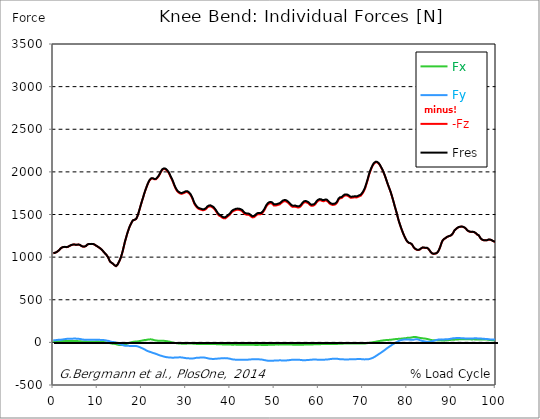
| Category |  Fx |  Fy |  -Fz |  Fres |
|---|---|---|---|---|
| 0.0 | 13.13 | 23.42 | 1044.74 | 1045.4 |
| 0.167348456675344 | 13.03 | 23.99 | 1047.57 | 1048.23 |
| 0.334696913350688 | 12.93 | 24.56 | 1050.39 | 1051.05 |
| 0.5020453700260321 | 13.1 | 25.89 | 1053.1 | 1053.77 |
| 0.669393826701376 | 13.39 | 27.31 | 1056.71 | 1057.39 |
| 0.83674228337672 | 13.74 | 28.32 | 1062.87 | 1063.55 |
| 1.0040907400520642 | 14.16 | 29.44 | 1068.6 | 1069.29 |
| 1.1621420602454444 | 14.28 | 29.87 | 1074.56 | 1075.24 |
| 1.3294905169207885 | 13.76 | 29.32 | 1083.38 | 1084.04 |
| 1.4968389735961325 | 14.11 | 29.59 | 1093.93 | 1094.59 |
| 1.6641874302714765 | 14.8 | 30.58 | 1102.71 | 1103.38 |
| 1.8315358869468206 | 14.91 | 31.75 | 1109.26 | 1109.94 |
| 1.9988843436221646 | 15.12 | 33.21 | 1113.77 | 1114.47 |
| 2.1662328002975086 | 15.27 | 34.6 | 1116.96 | 1117.7 |
| 2.333581256972853 | 15.54 | 35.99 | 1119.1 | 1119.87 |
| 2.5009297136481967 | 16.05 | 37.43 | 1119.98 | 1120.8 |
| 2.6682781703235405 | 16.32 | 38.75 | 1119.59 | 1120.46 |
| 2.8356266269988843 | 16.58 | 39.83 | 1116.8 | 1117.7 |
| 3.002975083674229 | 17.05 | 41.06 | 1116.68 | 1117.61 |
| 3.1703235403495724 | 17.52 | 42.12 | 1118.54 | 1119.5 |
| 3.337671997024917 | 17.31 | 42.03 | 1121.36 | 1122.32 |
| 3.4957233172182973 | 16.59 | 41.59 | 1124.92 | 1125.85 |
| 3.663071773893641 | 16.12 | 41.84 | 1131.47 | 1132.41 |
| 3.8304202305689854 | 15.96 | 42.09 | 1136.91 | 1137.86 |
| 3.997768687244329 | 16.28 | 42.57 | 1140.11 | 1141.07 |
| 4.165117143919673 | 16.83 | 43.03 | 1143.1 | 1144.08 |
| 4.332465600595017 | 17.16 | 43.49 | 1145.4 | 1146.4 |
| 4.499814057270361 | 17.27 | 44 | 1147.16 | 1148.18 |
| 4.667162513945706 | 17.28 | 44.38 | 1148.4 | 1149.44 |
| 4.834510970621049 | 16.98 | 44.33 | 1147.48 | 1148.52 |
| 5.001859427296393 | 16.86 | 44.5 | 1144.96 | 1146.01 |
| 5.169207883971737 | 16.72 | 43.94 | 1144.06 | 1145.1 |
| 5.336556340647081 | 15.89 | 42.63 | 1144.8 | 1145.78 |
| 5.503904797322425 | 15.12 | 42.28 | 1146.28 | 1147.23 |
| 5.671253253997769 | 14.48 | 41.87 | 1147.07 | 1148.01 |
| 5.82930457419115 | 14.15 | 41.4 | 1146.04 | 1146.96 |
| 5.996653030866494 | 13.93 | 40.48 | 1143.14 | 1144.04 |
| 6.164001487541838 | 13.38 | 39.12 | 1138.78 | 1139.65 |
| 6.331349944217181 | 11.65 | 36.2 | 1130.52 | 1131.39 |
| 6.498698400892526 | 10.52 | 34.15 | 1124.6 | 1125.48 |
| 6.66604685756787 | 10.25 | 33.22 | 1123.25 | 1124.14 |
| 6.833395314243213 | 10.06 | 31.94 | 1122.42 | 1123.27 |
| 7.000743770918558 | 9.83 | 31.46 | 1122.83 | 1123.69 |
| 7.168092227593902 | 9.6 | 31.32 | 1124.75 | 1125.63 |
| 7.335440684269246 | 9.3 | 31.08 | 1129.02 | 1129.94 |
| 7.50278914094459 | 8.84 | 30.25 | 1135.72 | 1136.67 |
| 7.6701375976199335 | 8.4 | 30.02 | 1145.78 | 1146.75 |
| 7.837486054295278 | 8.14 | 30.34 | 1150.02 | 1151 |
| 7.995537374488658 | 8.11 | 30.16 | 1153.33 | 1154.29 |
| 8.162885831164003 | 8.09 | 30.18 | 1154.93 | 1155.89 |
| 8.330234287839346 | 8.43 | 30.13 | 1153.94 | 1154.9 |
| 8.49758274451469 | 8.65 | 29.92 | 1153.38 | 1154.33 |
| 8.664931201190035 | 8.56 | 29.64 | 1154.48 | 1155.43 |
| 8.832279657865378 | 8.46 | 29.66 | 1154.69 | 1155.63 |
| 8.999628114540721 | 8.46 | 30.11 | 1153.1 | 1154.06 |
| 9.166976571216066 | 8.55 | 30.53 | 1150.47 | 1151.44 |
| 9.334325027891412 | 8.57 | 31.03 | 1146.01 | 1147.01 |
| 9.501673484566755 | 8.68 | 31.58 | 1140.18 | 1141.2 |
| 9.669021941242098 | 9.1 | 31.79 | 1133.74 | 1134.78 |
| 9.836370397917442 | 9.4 | 31.8 | 1128.05 | 1129.09 |
| 10.003718854592787 | 9.35 | 31.9 | 1123.65 | 1124.69 |
| 10.17106731126813 | 9.32 | 31.69 | 1118.65 | 1119.68 |
| 10.329118631461512 | 9.03 | 30.96 | 1112.27 | 1113.29 |
| 10.496467088136853 | 8.27 | 29.24 | 1105.78 | 1106.75 |
| 10.663815544812199 | 7.66 | 28.46 | 1099.43 | 1100.35 |
| 10.831164001487544 | 6.5 | 27.63 | 1092.27 | 1093.18 |
| 10.998512458162887 | 5.6 | 27.15 | 1083.94 | 1084.83 |
| 11.16586091483823 | 5.22 | 27.55 | 1074.71 | 1075.61 |
| 11.333209371513574 | 4.22 | 26.96 | 1063.79 | 1064.65 |
| 11.50055782818892 | 2.63 | 25.79 | 1052.78 | 1053.6 |
| 11.667906284864264 | 2.37 | 25.74 | 1043.7 | 1044.49 |
| 11.835254741539607 | 0.74 | 23.42 | 1034.31 | 1035.01 |
| 12.00260319821495 | -0.8 | 21.02 | 1026.03 | 1026.65 |
| 12.169951654890292 | -1.76 | 20.16 | 1015.76 | 1016.35 |
| 12.337300111565641 | -2.82 | 19.53 | 1000.92 | 1001.5 |
| 12.504648568240984 | -4.47 | 17.27 | 982.23 | 982.76 |
| 12.662699888434362 | -6.98 | 14.1 | 963.98 | 964.45 |
| 12.830048345109708 | -9.5 | 10.89 | 946.24 | 946.67 |
| 12.997396801785053 | -11.98 | 7.36 | 937.84 | 938.28 |
| 13.164745258460396 | -13.79 | 4.74 | 933.15 | 933.63 |
| 13.33209371513574 | -14.95 | 4.11 | 927.41 | 927.89 |
| 13.499442171811083 | -16.02 | 3.58 | 921.56 | 922.03 |
| 13.666790628486426 | -16.45 | 3.79 | 912.76 | 913.21 |
| 13.834139085161771 | -17.53 | 2.48 | 904.6 | 905.05 |
| 14.001487541837117 | -18.95 | 0.4 | 896.77 | 897.23 |
| 14.16883599851246 | -20.69 | -2.22 | 894.61 | 895.1 |
| 14.336184455187803 | -23.49 | -6.28 | 900.52 | 901.07 |
| 14.503532911863147 | -26.57 | -11.03 | 911.24 | 911.89 |
| 14.670881368538492 | -28.65 | -14.77 | 926.47 | 927.21 |
| 14.828932688731873 | -30.35 | -18.33 | 944.15 | 944.97 |
| 14.996281145407215 | -31.22 | -20.34 | 961.71 | 962.59 |
| 15.163629602082558 | -31.33 | -22.81 | 982.91 | 983.82 |
| 15.330978058757903 | -31.22 | -25.5 | 1007.71 | 1008.67 |
| 15.498326515433247 | -30.98 | -27.99 | 1036.47 | 1037.47 |
| 15.665674972108594 | -30.29 | -30.33 | 1068.24 | 1069.28 |
| 15.833023428783937 | -30.5 | -33.74 | 1103.97 | 1105.1 |
| 16.00037188545928 | -29.56 | -37.38 | 1140.15 | 1141.33 |
| 16.167720342134626 | -26.54 | -38.78 | 1177.28 | 1178.42 |
| 16.335068798809967 | -23.42 | -39.6 | 1207.48 | 1208.56 |
| 16.502417255485312 | -19.34 | -39.13 | 1238.02 | 1239.03 |
| 16.669765712160658 | -15.82 | -39.13 | 1268.8 | 1269.77 |
| 16.837114168836 | -11.96 | -39.88 | 1297.23 | 1298.19 |
| 17.004462625511344 | -9.05 | -40.69 | 1322.12 | 1323.08 |
| 17.16251394570472 | -6.18 | -41.59 | 1346.8 | 1347.79 |
| 17.32986240238007 | -3.07 | -42.03 | 1368.26 | 1369.25 |
| 17.497210859055414 | -0.83 | -42.18 | 1386.07 | 1387.06 |
| 17.664559315730756 | 1.4 | -42.32 | 1403.5 | 1404.49 |
| 17.8319077724061 | 3.68 | -42.36 | 1419.08 | 1420.05 |
| 17.999256229081443 | 5.96 | -42.54 | 1430.96 | 1431.94 |
| 18.166604685756788 | 7.83 | -42.61 | 1437.79 | 1438.77 |
| 18.333953142432133 | 8.64 | -41.86 | 1436.58 | 1437.55 |
| 18.501301599107478 | 9.32 | -41.35 | 1436.93 | 1437.88 |
| 18.668650055782823 | 9.83 | -42.05 | 1445.34 | 1446.32 |
| 18.835998512458165 | 10.23 | -43.58 | 1458.23 | 1459.27 |
| 19.00334696913351 | 11.38 | -45.82 | 1477.96 | 1479.07 |
| 19.170695425808855 | 12.81 | -48.89 | 1502.79 | 1504 |
| 19.338043882484197 | 14.24 | -52.24 | 1531.6 | 1532.91 |
| 19.496095202677576 | 15.66 | -55.63 | 1561.79 | 1563.19 |
| 19.66344365935292 | 17.06 | -59.23 | 1591.81 | 1593.32 |
| 19.830792116028263 | 18.68 | -63.28 | 1621.54 | 1623.21 |
| 19.998140572703612 | 20.64 | -67.01 | 1650.55 | 1652.39 |
| 20.165489029378953 | 22.52 | -70.87 | 1677.87 | 1679.88 |
| 20.3328374860543 | 24.74 | -74.95 | 1705.67 | 1707.86 |
| 20.500185942729644 | 26.55 | -79.57 | 1735.25 | 1737.65 |
| 20.667534399404985 | 27.96 | -83.92 | 1762.51 | 1765.1 |
| 20.83488285608033 | 28.52 | -88.97 | 1786.67 | 1789.53 |
| 21.002231312755672 | 29.02 | -93.74 | 1809.97 | 1813.06 |
| 21.16957976943102 | 30.49 | -98.19 | 1834.41 | 1837.73 |
| 21.336928226106362 | 32.38 | -101.86 | 1856.26 | 1859.79 |
| 21.504276682781704 | 33.67 | -105.36 | 1875.37 | 1879.07 |
| 21.67162513945705 | 34.7 | -108.5 | 1892.4 | 1896.26 |
| 21.82967645965043 | 35.38 | -111.21 | 1905.88 | 1909.89 |
| 21.997024916325774 | 35.61 | -113.83 | 1915.95 | 1920.09 |
| 22.16437337300112 | 35.12 | -116.83 | 1921.38 | 1925.67 |
| 22.33172182967646 | 33.45 | -120.11 | 1921.61 | 1926.05 |
| 22.499070286351806 | 31.04 | -123.61 | 1920.84 | 1925.42 |
| 22.666418743027148 | 28.21 | -126.16 | 1915.47 | 1920.19 |
| 22.833767199702496 | 25.8 | -128.49 | 1912.22 | 1917.08 |
| 23.00111565637784 | 23.92 | -130.96 | 1912.61 | 1917.61 |
| 23.168464113053183 | 22.25 | -133.92 | 1912.99 | 1918.18 |
| 23.335812569728528 | 21.15 | -137.73 | 1917.05 | 1922.5 |
| 23.50316102640387 | 20.61 | -140.65 | 1928.8 | 1934.42 |
| 23.670509483079215 | 20.03 | -144.54 | 1939.88 | 1945.75 |
| 23.83785793975456 | 19.07 | -148.35 | 1951.04 | 1957.16 |
| 23.995909259947936 | 19.2 | -151.58 | 1966.91 | 1973.23 |
| 24.163257716623285 | 19.66 | -154.01 | 1983.57 | 1990.03 |
| 24.330606173298627 | 19.54 | -156.4 | 2000.06 | 2006.66 |
| 24.49795462997397 | 19.77 | -158.88 | 2013.6 | 2020.37 |
| 24.665303086649313 | 19.84 | -161.47 | 2025.67 | 2032.62 |
| 24.83265154332466 | 19.2 | -164.35 | 2032.11 | 2039.28 |
| 25.0 | 18.29 | -166.88 | 2034.04 | 2041.38 |
| 25.167348456675345 | 17.34 | -168.93 | 2034.27 | 2041.77 |
| 25.334696913350694 | 16.26 | -170.71 | 2030.72 | 2038.36 |
| 25.502045370026035 | 15.04 | -172.46 | 2024.66 | 2032.46 |
| 25.669393826701377 | 13.69 | -174.12 | 2016.06 | 2023.99 |
| 25.836742283376722 | 12.58 | -175.15 | 2005.9 | 2013.95 |
| 26.004090740052067 | 11.13 | -176.21 | 1994.48 | 2002.66 |
| 26.17143919672741 | 9.46 | -177.28 | 1979.63 | 1987.94 |
| 26.329490516920792 | 7.91 | -177.39 | 1961.72 | 1970.09 |
| 26.49683897359613 | 5.37 | -177.16 | 1939.95 | 1948.32 |
| 26.66418743027148 | 2.41 | -178.67 | 1925.26 | 1933.79 |
| 26.831535886946828 | -0.1 | -180.23 | 1907.36 | 1916.09 |
| 26.998884343622166 | -1.88 | -180.92 | 1886.3 | 1895.17 |
| 27.166232800297514 | -3.19 | -179.72 | 1864.22 | 1873.12 |
| 27.333581256972852 | -4.9 | -178.7 | 1839.83 | 1848.79 |
| 27.5009297136482 | -6.24 | -178.15 | 1821 | 1830.02 |
| 27.668278170323543 | -7.89 | -177.97 | 1802.69 | 1811.8 |
| 27.835626626998888 | -9.51 | -177.18 | 1786.74 | 1795.87 |
| 28.002975083674233 | -10.9 | -176.61 | 1773.23 | 1782.38 |
| 28.170323540349575 | -12.11 | -176.24 | 1762.73 | 1771.92 |
| 28.33767199702492 | -13.31 | -176.02 | 1756.58 | 1765.8 |
| 28.50502045370026 | -13.98 | -175.43 | 1751.03 | 1760.24 |
| 28.663071773893645 | -14.35 | -175.62 | 1746.83 | 1756.11 |
| 28.830420230568986 | -14.7 | -176.06 | 1743.8 | 1753.16 |
| 28.99776868724433 | -14.85 | -176.34 | 1741.62 | 1751.03 |
| 29.165117143919673 | -14.65 | -177.28 | 1743.63 | 1753.15 |
| 29.33246560059502 | -14.88 | -179.47 | 1748.45 | 1758.19 |
| 29.499814057270367 | -14.81 | -180.87 | 1749.97 | 1759.84 |
| 29.66716251394571 | -15.05 | -182.26 | 1755.24 | 1765.22 |
| 29.834510970621054 | -15.05 | -183.69 | 1759.64 | 1769.74 |
| 30.00185942729639 | -14.97 | -185.15 | 1763.57 | 1773.8 |
| 30.169207883971744 | -14.75 | -186.31 | 1764.51 | 1774.85 |
| 30.33655634064708 | -14.56 | -187.25 | 1761.52 | 1771.99 |
| 30.50390479732243 | -13.72 | -187.58 | 1755.58 | 1766.14 |
| 30.671253253997772 | -12.8 | -187.63 | 1749.36 | 1759.98 |
| 30.829304574191156 | -12.22 | -188.17 | 1740.91 | 1751.65 |
| 30.996653030866494 | -12.4 | -188.68 | 1729.01 | 1739.89 |
| 31.164001487541842 | -13.08 | -189.09 | 1713.84 | 1724.85 |
| 31.331349944217187 | -13.74 | -188.76 | 1697.11 | 1708.17 |
| 31.498698400892525 | -14.6 | -188.58 | 1677.61 | 1688.75 |
| 31.666046857567874 | -15.69 | -187.93 | 1653.88 | 1665.08 |
| 31.833395314243212 | -16.69 | -185.76 | 1630.86 | 1641.97 |
| 32.00074377091856 | -17.15 | -184.56 | 1615.5 | 1626.56 |
| 32.1680922275939 | -17.3 | -182.64 | 1602.09 | 1613.01 |
| 32.33544068426925 | -17.75 | -180.92 | 1591.23 | 1602.01 |
| 32.50278914094459 | -18.19 | -180.14 | 1580.07 | 1590.85 |
| 32.670137597619934 | -18.68 | -179.64 | 1571.67 | 1582.45 |
| 32.83748605429528 | -19.06 | -179.3 | 1566.22 | 1577 |
| 33.004834510970625 | -19.48 | -179.14 | 1561.85 | 1572.63 |
| 33.162885831164004 | -19.69 | -178.8 | 1560.08 | 1570.84 |
| 33.33023428783935 | -19.59 | -178.13 | 1558.45 | 1569.14 |
| 33.497582744514695 | -19.28 | -177.22 | 1554.57 | 1565.19 |
| 33.664931201190036 | -18.92 | -176.39 | 1550.01 | 1560.57 |
| 33.83227965786538 | -18.72 | -176.42 | 1549.54 | 1560.1 |
| 33.99962811454073 | -18.9 | -176.89 | 1551.74 | 1562.34 |
| 34.16697657121607 | -19.06 | -178.32 | 1553.51 | 1564.28 |
| 34.33432502789141 | -19.08 | -179.98 | 1557.18 | 1568.13 |
| 34.50167348456676 | -18.9 | -181.38 | 1563.62 | 1574.7 |
| 34.6690219412421 | -19.02 | -183.34 | 1573.78 | 1585.02 |
| 34.83637039791744 | -19.07 | -186.04 | 1583.94 | 1595.42 |
| 35.00371885459279 | -19.11 | -187.6 | 1590.08 | 1601.71 |
| 35.17106731126814 | -19.26 | -189.72 | 1592.96 | 1604.83 |
| 35.338415767943474 | -19.28 | -191.53 | 1595.56 | 1607.64 |
| 35.49646708813686 | -19.31 | -192.34 | 1595.99 | 1608.16 |
| 35.6638155448122 | -19.43 | -192.95 | 1593.15 | 1605.44 |
| 35.831164001487544 | -19.86 | -193.88 | 1587.09 | 1599.57 |
| 35.998512458162885 | -19.97 | -194.48 | 1582.16 | 1594.76 |
| 36.165860914838234 | -19.98 | -194.71 | 1576.61 | 1589.28 |
| 36.333209371513576 | -19.98 | -194.2 | 1567.81 | 1580.49 |
| 36.50055782818892 | -20.08 | -193.45 | 1557.75 | 1570.41 |
| 36.667906284864266 | -20.29 | -192.25 | 1545.91 | 1558.51 |
| 36.83525474153961 | -20.74 | -191.68 | 1532.21 | 1544.85 |
| 37.002603198214956 | -21.24 | -191.49 | 1518.38 | 1531.12 |
| 37.1699516548903 | -21.32 | -190.57 | 1504.78 | 1517.53 |
| 37.337300111565646 | -21.52 | -188.98 | 1494.48 | 1507.1 |
| 37.50464856824098 | -22.26 | -188.21 | 1485.99 | 1498.61 |
| 37.66269988843437 | -22.56 | -187.95 | 1481.14 | 1493.77 |
| 37.83004834510971 | -22.86 | -187.59 | 1477.66 | 1490.26 |
| 37.99739680178505 | -23.28 | -187.21 | 1471.28 | 1483.9 |
| 38.16474525846039 | -23.45 | -186.28 | 1462.98 | 1475.56 |
| 38.33209371513574 | -23.88 | -185.47 | 1457.71 | 1470.24 |
| 38.49944217181109 | -24.37 | -184.89 | 1454.88 | 1467.38 |
| 38.666790628486424 | -24.69 | -184.73 | 1454.11 | 1466.6 |
| 38.83413908516178 | -25.03 | -184.66 | 1454.51 | 1466.99 |
| 39.001487541837115 | -25.18 | -185.02 | 1459.47 | 1471.96 |
| 39.16883599851246 | -25.51 | -185.79 | 1466.34 | 1478.89 |
| 39.336184455187805 | -25.67 | -186.8 | 1473.9 | 1486.53 |
| 39.503532911863154 | -25.9 | -187.92 | 1481.01 | 1493.74 |
| 39.670881368538495 | -26.2 | -189.55 | 1486.91 | 1499.79 |
| 39.83822982521384 | -26.15 | -191.2 | 1494.13 | 1507.17 |
| 39.996281145407224 | -26.06 | -192.36 | 1504.26 | 1517.35 |
| 40.163629602082565 | -26.38 | -194.47 | 1515.45 | 1528.72 |
| 40.33097805875791 | -26.55 | -197.78 | 1527.7 | 1541.29 |
| 40.498326515433256 | -26.53 | -199.22 | 1534.43 | 1548.13 |
| 40.6656749721086 | -26.54 | -200.39 | 1539.97 | 1553.77 |
| 40.83302342878393 | -26.52 | -201.38 | 1543.62 | 1557.5 |
| 41.00037188545929 | -26.34 | -202.01 | 1546.91 | 1560.83 |
| 41.16772034213463 | -26.42 | -203.09 | 1549.98 | 1564.02 |
| 41.33506879880997 | -26.48 | -203.79 | 1553.99 | 1568.07 |
| 41.50241725548531 | -26.63 | -203.9 | 1555.97 | 1570.04 |
| 41.66976571216066 | -27 | -204.62 | 1555.08 | 1569.25 |
| 41.837114168836 | -27.14 | -204.96 | 1554.64 | 1568.87 |
| 42.004462625511344 | -27.2 | -205.19 | 1553.96 | 1568.22 |
| 42.17181108218669 | -27.28 | -205.44 | 1552.15 | 1566.46 |
| 42.32986240238007 | -27.19 | -205.14 | 1548.51 | 1562.81 |
| 42.497210859055414 | -27.1 | -204.84 | 1544.86 | 1559.15 |
| 42.66455931573076 | -27.15 | -204.54 | 1540.16 | 1554.46 |
| 42.831907772406105 | -27.42 | -204.23 | 1532.45 | 1546.77 |
| 42.999256229081446 | -27.8 | -203.32 | 1520.2 | 1534.53 |
| 43.16660468575679 | -28.13 | -203.19 | 1509.98 | 1524.41 |
| 43.33395314243214 | -28.33 | -202.94 | 1503.69 | 1518.16 |
| 43.50130159910748 | -28.4 | -202.69 | 1499.74 | 1514.22 |
| 43.66865005578282 | -28.54 | -202.89 | 1498.2 | 1512.73 |
| 43.83599851245817 | -28.57 | -202.79 | 1497.91 | 1512.42 |
| 44.00334696913351 | -28.6 | -202.68 | 1497.63 | 1512.13 |
| 44.17069542580886 | -28.63 | -202.12 | 1495.58 | 1510.02 |
| 44.3380438824842 | -28.66 | -201.48 | 1492.51 | 1506.88 |
| 44.49609520267758 | -28.82 | -201.22 | 1487.06 | 1501.44 |
| 44.66344365935292 | -28.66 | -199.92 | 1478.23 | 1492.52 |
| 44.83079211602827 | -28.69 | -198.84 | 1471.77 | 1485.97 |
| 44.99814057270361 | -28.78 | -197.82 | 1465.99 | 1480.11 |
| 45.16548902937895 | -29.01 | -197.39 | 1465.29 | 1479.37 |
| 45.332837486054295 | -29.2 | -197.11 | 1468.42 | 1482.43 |
| 45.500185942729644 | -29.37 | -197.05 | 1473.44 | 1487.39 |
| 45.66753439940499 | -29.58 | -197.5 | 1479.52 | 1493.47 |
| 45.83488285608033 | -29.62 | -197.49 | 1487.49 | 1501.35 |
| 46.00223131275568 | -29.5 | -198.29 | 1497.04 | 1510.9 |
| 46.16957976943102 | -29.46 | -198.32 | 1501.25 | 1515.06 |
| 46.336928226106366 | -29.4 | -198.79 | 1504.6 | 1518.43 |
| 46.50427668278171 | -29.23 | -199.73 | 1505.81 | 1519.76 |
| 46.671625139457056 | -29.11 | -199.51 | 1503.69 | 1517.62 |
| 46.829676459650436 | -29.1 | -199.22 | 1501.45 | 1515.36 |
| 46.99702491632577 | -29.45 | -200.47 | 1504.54 | 1518.61 |
| 47.16437337300112 | -29.84 | -201.65 | 1511.44 | 1525.61 |
| 47.33172182967646 | -30.03 | -203.32 | 1521.28 | 1535.58 |
| 47.49907028635181 | -30.15 | -205.27 | 1532.79 | 1547.25 |
| 47.66641874302716 | -30.2 | -207.57 | 1546.9 | 1561.54 |
| 47.83376719970249 | -30.15 | -209.51 | 1561.93 | 1576.67 |
| 48.001115656377834 | -30.21 | -210.86 | 1580.01 | 1594.76 |
| 48.16846411305319 | -30.18 | -212.33 | 1596.28 | 1611.06 |
| 48.33581256972853 | -29.78 | -213.84 | 1607.84 | 1622.7 |
| 48.50316102640387 | -29.48 | -215.03 | 1618.19 | 1633.11 |
| 48.67050948307921 | -28.94 | -215.78 | 1625.49 | 1640.44 |
| 48.837857939754564 | -28.35 | -216.13 | 1629.76 | 1644.7 |
| 49.005206396429905 | -27.94 | -216.34 | 1632.21 | 1647.15 |
| 49.163257716623285 | -27.49 | -216.15 | 1631.78 | 1646.7 |
| 49.33060617329863 | -27.06 | -216.12 | 1629.59 | 1644.52 |
| 49.49795462997397 | -26.9 | -215.84 | 1626.08 | 1640.99 |
| 49.66530308664932 | -26.8 | -215.13 | 1617.3 | 1632.19 |
| 49.832651543324666 | -26.9 | -213.54 | 1606.4 | 1621.18 |
| 50.0 | -26.64 | -213.34 | 1603.72 | 1618.49 |
| 50.16734845667534 | -26.36 | -212.87 | 1604.67 | 1619.37 |
| 50.33469691335069 | -25.97 | -212.53 | 1605.25 | 1619.89 |
| 50.50204537002604 | -26.01 | -211.91 | 1607.35 | 1621.89 |
| 50.66939382670139 | -26.34 | -211.5 | 1610.14 | 1624.59 |
| 50.836742283376715 | -26.42 | -211.12 | 1613.17 | 1627.52 |
| 51.00409074005207 | -26.47 | -211.16 | 1614.91 | 1629.24 |
| 51.17143919672741 | -26.19 | -211.17 | 1618.04 | 1632.33 |
| 51.32949051692079 | -25.94 | -211.03 | 1624.53 | 1638.74 |
| 51.496838973596134 | -25.69 | -211.15 | 1632.25 | 1646.41 |
| 51.66418743027148 | -25.46 | -211.38 | 1640.56 | 1654.69 |
| 51.831535886946824 | -25.5 | -211.79 | 1648.16 | 1662.28 |
| 51.99888434362217 | -25.47 | -211.91 | 1651.74 | 1665.85 |
| 52.16623280029752 | -25.41 | -212.16 | 1654.53 | 1668.66 |
| 52.33358125697285 | -25.09 | -212.14 | 1655.72 | 1669.85 |
| 52.5009297136482 | -24.92 | -211.97 | 1654.91 | 1669.04 |
| 52.668278170323546 | -24.92 | -211.7 | 1652.74 | 1666.87 |
| 52.835626626998895 | -24.92 | -211.37 | 1646.71 | 1660.84 |
| 53.00297508367424 | -25.07 | -210.44 | 1639.96 | 1654.02 |
| 53.17032354034958 | -25.25 | -209.32 | 1632.97 | 1646.95 |
| 53.33767199702492 | -25.55 | -208.41 | 1624.71 | 1638.65 |
| 53.50502045370027 | -25.74 | -207.49 | 1616.37 | 1630.27 |
| 53.663071773893655 | -25.91 | -205.89 | 1604.69 | 1618.49 |
| 53.83042023056899 | -26.1 | -204.74 | 1596.46 | 1610.19 |
| 53.99776868724433 | -26.43 | -204.15 | 1591.97 | 1605.68 |
| 54.16511714391967 | -26.87 | -203.95 | 1589.42 | 1603.15 |
| 54.33246560059503 | -27.13 | -204.1 | 1588.96 | 1602.73 |
| 54.49981405727037 | -27.18 | -203.87 | 1590.47 | 1604.19 |
| 54.667162513945705 | -27.15 | -203.64 | 1591.91 | 1605.57 |
| 54.834510970621054 | -27.12 | -203.52 | 1589.16 | 1602.82 |
| 55.0018594272964 | -27.25 | -203.57 | 1585.66 | 1599.38 |
| 55.169207883971744 | -27.42 | -203.55 | 1583.39 | 1597.14 |
| 55.336556340647086 | -27.61 | -203.49 | 1582.11 | 1595.86 |
| 55.50390479732243 | -27.85 | -204.25 | 1582.12 | 1595.99 |
| 55.671253253997776 | -27.84 | -204.91 | 1585.64 | 1599.57 |
| 55.83860171067312 | -27.87 | -205.42 | 1591.81 | 1605.76 |
| 55.9966530308665 | -27.68 | -206.39 | 1600.36 | 1614.37 |
| 56.16400148754184 | -27.55 | -207.96 | 1611.5 | 1625.61 |
| 56.33134994421718 | -27.21 | -209.01 | 1624.52 | 1638.66 |
| 56.498698400892536 | -26.81 | -209.46 | 1634.33 | 1648.44 |
| 56.66604685756788 | -26.34 | -209.56 | 1640.09 | 1654.15 |
| 56.83339531424321 | -26.03 | -209.05 | 1643.97 | 1657.92 |
| 57.00074377091856 | -25.72 | -208.68 | 1644.8 | 1658.69 |
| 57.16809222759391 | -25.46 | -208.42 | 1643.27 | 1657.14 |
| 57.33544068426925 | -25.01 | -207.94 | 1639.82 | 1653.64 |
| 57.5027891409446 | -24.39 | -207.26 | 1636.54 | 1650.29 |
| 57.670137597619934 | -23.94 | -206.51 | 1630.91 | 1644.61 |
| 57.83748605429528 | -23.89 | -206.06 | 1621.09 | 1634.8 |
| 58.004834510970625 | -23.87 | -204.9 | 1612.7 | 1626.33 |
| 58.16288583116401 | -23.99 | -203.83 | 1606.24 | 1619.78 |
| 58.330234287839346 | -24.12 | -203.27 | 1601.99 | 1615.49 |
| 58.497582744514695 | -23.98 | -202.6 | 1601.45 | 1614.87 |
| 58.66493120119004 | -23.76 | -201.95 | 1602.95 | 1616.27 |
| 58.832279657865385 | -23.47 | -202.13 | 1604.99 | 1618.3 |
| 58.999628114540734 | -23.17 | -202.15 | 1609.77 | 1623.04 |
| 59.16697657121607 | -22.61 | -202.17 | 1617.38 | 1630.57 |
| 59.33432502789142 | -22.18 | -202.08 | 1628.26 | 1641.35 |
| 59.50167348456676 | -21.53 | -202.29 | 1642.89 | 1655.9 |
| 59.66902194124211 | -21.39 | -202.52 | 1651.9 | 1664.86 |
| 59.83637039791745 | -21.43 | -203.4 | 1659.05 | 1672.06 |
| 60.00371885459278 | -21.38 | -204.21 | 1664.82 | 1677.89 |
| 60.17106731126813 | -21.19 | -204.63 | 1667.55 | 1680.65 |
| 60.33841576794349 | -20.88 | -204.66 | 1667.2 | 1680.31 |
| 60.49646708813685 | -20.59 | -204.47 | 1665.81 | 1678.92 |
| 60.6638155448122 | -20.17 | -204.1 | 1661.58 | 1674.67 |
| 60.831164001487544 | -20.14 | -203.52 | 1657.15 | 1670.2 |
| 60.99851245816289 | -20.04 | -202.99 | 1655.45 | 1668.45 |
| 61.16586091483824 | -19.95 | -202.59 | 1655.95 | 1668.9 |
| 61.333209371513576 | -19.99 | -202.48 | 1660.03 | 1672.95 |
| 61.50055782818892 | -19.95 | -202.33 | 1663.78 | 1676.67 |
| 61.667906284864266 | -19.69 | -202.04 | 1664.79 | 1677.64 |
| 61.835254741539615 | -19.65 | -201.54 | 1661.44 | 1674.26 |
| 62.002603198214956 | -19.72 | -200.67 | 1655.53 | 1668.29 |
| 62.16995165489029 | -19.88 | -199.5 | 1645.31 | 1658.01 |
| 62.33730011156564 | -20.04 | -198.08 | 1634.27 | 1646.89 |
| 62.504648568240995 | -20.05 | -196.83 | 1626.67 | 1639.2 |
| 62.67199702491633 | -19.8 | -195.53 | 1622.35 | 1634.76 |
| 62.83004834510971 | -19.45 | -194.34 | 1616.72 | 1629.02 |
| 62.99739680178505 | -19.29 | -193.34 | 1612.89 | 1625.09 |
| 63.1647452584604 | -19.18 | -192.78 | 1612.07 | 1624.19 |
| 63.33209371513575 | -19.14 | -192.69 | 1612.9 | 1624.99 |
| 63.4994421718111 | -19.16 | -192.77 | 1613.93 | 1626.01 |
| 63.666790628486424 | -19.13 | -192.67 | 1616.16 | 1628.2 |
| 63.83413908516177 | -18.97 | -192.39 | 1621.15 | 1633.11 |
| 64.00148754183712 | -18.71 | -192.52 | 1628.5 | 1640.42 |
| 64.16883599851248 | -18.18 | -192.82 | 1640.93 | 1652.81 |
| 64.3361844551878 | -17.53 | -193.61 | 1657.7 | 1669.56 |
| 64.50353291186315 | -16.78 | -195.37 | 1675.53 | 1687.47 |
| 64.6708813685385 | -16.53 | -196.64 | 1683.37 | 1695.41 |
| 64.83822982521384 | -16.29 | -197.7 | 1690.56 | 1702.68 |
| 65.00557828188919 | -16.05 | -198.38 | 1693.49 | 1705.67 |
| 65.16362960208257 | -15.78 | -198.4 | 1692.47 | 1704.66 |
| 65.3309780587579 | -15.5 | -198.22 | 1694.28 | 1706.44 |
| 65.49832651543326 | -15.1 | -198.78 | 1708.02 | 1720.16 |
| 65.6656749721086 | -14.51 | -199.41 | 1716.88 | 1729.05 |
| 65.83302342878395 | -14.38 | -199.92 | 1721.05 | 1733.28 |
| 66.00037188545929 | -14.24 | -200.17 | 1723.16 | 1735.43 |
| 66.16772034213463 | -14.13 | -200.64 | 1723.52 | 1735.85 |
| 66.33506879880998 | -13.91 | -200.91 | 1722.64 | 1735.02 |
| 66.50241725548531 | -13.59 | -201.01 | 1720.67 | 1733.08 |
| 66.66976571216065 | -13.36 | -200.63 | 1716.82 | 1729.21 |
| 66.83711416883601 | -13.48 | -199.56 | 1710.32 | 1722.65 |
| 67.00446262551135 | -13.66 | -198.43 | 1703.62 | 1715.87 |
| 67.1718110821867 | -13.9 | -197.48 | 1697.56 | 1709.75 |
| 67.32986240238007 | -14.16 | -197.31 | 1696.32 | 1708.52 |
| 67.49721085905541 | -14.26 | -197.53 | 1697.16 | 1709.4 |
| 67.66455931573076 | -14.17 | -197.61 | 1698.17 | 1710.41 |
| 67.83190777240611 | -14.09 | -197.62 | 1699.48 | 1711.7 |
| 67.99925622908145 | -14.02 | -197.49 | 1701.31 | 1713.5 |
| 68.16660468575678 | -14.11 | -197.53 | 1701.66 | 1713.85 |
| 68.33395314243214 | -14.16 | -197 | 1701.02 | 1713.16 |
| 68.50130159910749 | -14 | -196.43 | 1700.04 | 1712.12 |
| 68.66865005578282 | -13.85 | -196.19 | 1700.42 | 1712.46 |
| 68.83599851245816 | -14.12 | -196.21 | 1704.7 | 1716.71 |
| 69.00334696913352 | -14.03 | -196.28 | 1710.73 | 1722.69 |
| 69.17069542580886 | -13.86 | -196.34 | 1713.35 | 1725.3 |
| 69.3380438824842 | -13.71 | -196.25 | 1715.31 | 1727.24 |
| 69.50539233915956 | -13.77 | -196 | 1720.44 | 1732.33 |
| 69.66344365935292 | -13.78 | -196.54 | 1729.51 | 1741.42 |
| 69.83079211602826 | -13.73 | -197.78 | 1742.03 | 1754.01 |
| 69.99814057270362 | -13.69 | -199.03 | 1754.55 | 1766.6 |
| 70.16548902937896 | -13.31 | -199.45 | 1770.14 | 1782.12 |
| 70.33283748605429 | -12.79 | -199.49 | 1787.14 | 1798.99 |
| 70.50018594272964 | -12.28 | -199.99 | 1808.4 | 1820.14 |
| 70.667534399405 | -11.52 | -199.34 | 1836.54 | 1847.99 |
| 70.83488285608033 | -10.21 | -198.48 | 1864.07 | 1875.17 |
| 71.00223131275568 | -9.13 | -197.66 | 1892.51 | 1903.34 |
| 71.16957976943102 | -7.86 | -197.53 | 1922.82 | 1933.43 |
| 71.33692822610637 | -6.32 | -196.83 | 1955.57 | 1965.91 |
| 71.50427668278171 | -4.66 | -194.44 | 1983.5 | 1993.43 |
| 71.67162513945706 | -3.1 | -192.08 | 2008.05 | 2017.59 |
| 71.8389735961324 | -1.62 | -189.16 | 2030.42 | 2039.56 |
| 71.99702491632577 | -0.24 | -186.09 | 2050.4 | 2059.13 |
| 72.16437337300113 | 1.19 | -182.49 | 2068.98 | 2077.28 |
| 72.33172182967647 | 2.66 | -178.59 | 2084.18 | 2092.06 |
| 72.49907028635181 | 4.11 | -174.14 | 2096.44 | 2103.87 |
| 72.66641874302715 | 5.55 | -168.71 | 2105.24 | 2112.18 |
| 72.8337671997025 | 7.23 | -163.31 | 2111.25 | 2117.74 |
| 73.00111565637783 | 8.95 | -157.56 | 2113.1 | 2119.15 |
| 73.16846411305319 | 10.8 | -151.98 | 2112.12 | 2117.78 |
| 73.33581256972853 | 12.61 | -146.27 | 2108.1 | 2113.36 |
| 73.50316102640387 | 13.99 | -140.48 | 2101.19 | 2106.08 |
| 73.67050948307921 | 15.73 | -134.82 | 2090.37 | 2094.93 |
| 73.83785793975457 | 17.07 | -129.02 | 2078.55 | 2082.77 |
| 74.00520639642991 | 18.88 | -123.72 | 2062.8 | 2066.78 |
| 74.16325771662328 | 20.4 | -118.15 | 2046.24 | 2049.94 |
| 74.33060617329863 | 21.7 | -111.47 | 2030.29 | 2033.7 |
| 74.49795462997398 | 22.94 | -105.93 | 2012.06 | 2015.23 |
| 74.66530308664932 | 23.86 | -99.3 | 1992.48 | 1995.41 |
| 74.83265154332466 | 24.7 | -93.01 | 1970.7 | 1973.37 |
| 75.00000000000001 | 25.57 | -86.47 | 1947.44 | 1949.82 |
| 75.16734845667534 | 26.7 | -79.62 | 1922.93 | 1925.04 |
| 75.3346969133507 | 27.5 | -73.15 | 1896.81 | 1898.7 |
| 75.50204537002605 | 27.99 | -66.8 | 1871.3 | 1872.97 |
| 75.66939382670138 | 28.51 | -60.35 | 1846.79 | 1848.33 |
| 75.83674228337672 | 28.89 | -54.41 | 1823.89 | 1825.32 |
| 76.00409074005208 | 29.62 | -48.9 | 1801.04 | 1802.38 |
| 76.17143919672742 | 30.38 | -43.35 | 1777.77 | 1779.02 |
| 76.33878765340276 | 31.32 | -37.56 | 1751.8 | 1752.97 |
| 76.49683897359614 | 32.32 | -31.52 | 1724.08 | 1725.14 |
| 76.66418743027148 | 33.41 | -25.36 | 1694.33 | 1695.27 |
| 76.83153588694682 | 34.8 | -20.47 | 1664.71 | 1665.6 |
| 76.99888434362218 | 36.07 | -15.49 | 1633.27 | 1634.11 |
| 77.16623280029752 | 37.31 | -9.18 | 1599.72 | 1600.48 |
| 77.33358125697285 | 38.22 | -4.39 | 1571.47 | 1572.24 |
| 77.5009297136482 | 38.88 | 0 | 1540.85 | 1541.64 |
| 77.66827817032356 | 39.52 | 4.37 | 1510.04 | 1510.86 |
| 77.83562662699889 | 40.48 | 9.67 | 1474.79 | 1475.61 |
| 78.00297508367423 | 41.57 | 14.34 | 1442.54 | 1443.43 |
| 78.17032354034959 | 42.94 | 18.34 | 1413.29 | 1414.27 |
| 78.33767199702493 | 43.61 | 22.12 | 1387.02 | 1388.08 |
| 78.50502045370027 | 44.04 | 24.43 | 1361.01 | 1362.15 |
| 78.67236891037561 | 43.99 | 26.83 | 1335.85 | 1337.06 |
| 78.83042023056899 | 44.62 | 28.58 | 1312.81 | 1314.08 |
| 78.99776868724433 | 45.63 | 30.51 | 1290.03 | 1291.38 |
| 79.16511714391969 | 46.65 | 32.36 | 1268.24 | 1269.67 |
| 79.33246560059503 | 47.67 | 34.05 | 1248.35 | 1249.85 |
| 79.49981405727036 | 48.07 | 34.21 | 1230.53 | 1232.05 |
| 79.66716251394571 | 49.06 | 34.5 | 1212.82 | 1214.41 |
| 79.83451097062107 | 51.17 | 35.07 | 1196.11 | 1197.82 |
| 80.00185942729641 | 52.83 | 35.06 | 1183.35 | 1185.14 |
| 80.16920788397174 | 53.83 | 34.66 | 1174 | 1175.84 |
| 80.33655634064709 | 54.3 | 34.06 | 1167.43 | 1169.28 |
| 80.50390479732243 | 54.44 | 33.21 | 1163.7 | 1165.54 |
| 80.67125325399778 | 54.69 | 31.33 | 1162.68 | 1164.49 |
| 80.83860171067312 | 55.58 | 30.08 | 1159.98 | 1161.82 |
| 80.99665303086651 | 57.9 | 30.15 | 1153.28 | 1155.27 |
| 81.16400148754184 | 59.94 | 30.43 | 1141.48 | 1143.61 |
| 81.3313499442172 | 61.71 | 30.68 | 1126.92 | 1129.18 |
| 81.49869840089255 | 63.09 | 32.34 | 1111.65 | 1114.08 |
| 81.66604685756786 | 63.37 | 33.7 | 1102.24 | 1104.75 |
| 81.83339531424322 | 63.1 | 35.59 | 1095.45 | 1098.02 |
| 82.00074377091858 | 63.03 | 36.79 | 1089.54 | 1092.17 |
| 82.16809222759392 | 61.29 | 36.81 | 1085.5 | 1088.03 |
| 82.33544068426926 | 58.47 | 36.09 | 1082.19 | 1084.54 |
| 82.50278914094459 | 55.99 | 34.2 | 1082.88 | 1085.06 |
| 82.67013759761994 | 54.09 | 30.55 | 1084.97 | 1087.02 |
| 82.83748605429528 | 52.42 | 26.45 | 1088.15 | 1090.11 |
| 83.00483451097062 | 51.54 | 23.09 | 1094.05 | 1096 |
| 83.17218296764597 | 50.21 | 20.76 | 1101.84 | 1103.74 |
| 83.33023428783935 | 48.68 | 18.39 | 1109.44 | 1111.27 |
| 83.4975827445147 | 47.52 | 16.37 | 1111.83 | 1113.62 |
| 83.66493120119004 | 46.79 | 14.54 | 1112.58 | 1114.3 |
| 83.83227965786537 | 46.11 | 12.84 | 1110.13 | 1111.87 |
| 83.99962811454073 | 45.34 | 11.07 | 1107.48 | 1109.22 |
| 84.16697657121607 | 43.8 | 9.05 | 1106.95 | 1108.63 |
| 84.33432502789142 | 42.11 | 8.28 | 1107.99 | 1109.59 |
| 84.50167348456677 | 40.29 | 7.69 | 1107.65 | 1109.16 |
| 84.6690219412421 | 38.1 | 6.71 | 1102.66 | 1104.06 |
| 84.83637039791745 | 36.36 | 6.13 | 1094.48 | 1095.82 |
| 85.0037188545928 | 34.04 | 6.75 | 1083.06 | 1084.31 |
| 85.17106731126813 | 31.11 | 8.41 | 1070.91 | 1072.05 |
| 85.33841576794349 | 28.67 | 10.43 | 1057.94 | 1059.06 |
| 85.50576422461883 | 27.32 | 12.43 | 1049.11 | 1050.23 |
| 85.66381554481221 | 25.8 | 13.97 | 1042.69 | 1043.82 |
| 85.83116400148755 | 23.95 | 15.74 | 1039.91 | 1041.02 |
| 85.99851245816289 | 23.7 | 18.2 | 1038.67 | 1039.71 |
| 86.16586091483823 | 23.81 | 20.88 | 1038.17 | 1039.14 |
| 86.33320937151358 | 23.82 | 23.81 | 1041.14 | 1042.1 |
| 86.50055782818893 | 23.99 | 26.49 | 1044.22 | 1045.18 |
| 86.66790628486427 | 24.67 | 28.86 | 1046.36 | 1047.37 |
| 86.83525474153961 | 25.92 | 30.99 | 1053.6 | 1054.69 |
| 87.00260319821496 | 26.04 | 32.5 | 1065.04 | 1066.19 |
| 87.16995165489031 | 25.72 | 33.05 | 1081.83 | 1083.02 |
| 87.33730011156564 | 25.13 | 33.87 | 1102.03 | 1103.25 |
| 87.504648568241 | 24.36 | 34.33 | 1124.41 | 1125.64 |
| 87.67199702491634 | 23.19 | 35.19 | 1150.3 | 1151.51 |
| 87.83004834510972 | 21.91 | 35.47 | 1174.91 | 1176.07 |
| 87.99739680178506 | 21.21 | 34.82 | 1193.29 | 1194.41 |
| 88.1647452584604 | 20.99 | 34.34 | 1204.64 | 1205.75 |
| 88.33209371513574 | 21.65 | 34.41 | 1212.19 | 1213.32 |
| 88.49944217181108 | 23.43 | 35.04 | 1215.36 | 1216.54 |
| 88.66679062848644 | 24.57 | 36.5 | 1222.27 | 1223.53 |
| 88.83413908516178 | 24.59 | 37.29 | 1231.6 | 1232.89 |
| 89.00148754183712 | 24.07 | 36.84 | 1236.65 | 1237.9 |
| 89.16883599851246 | 24.69 | 37.25 | 1239.8 | 1241.04 |
| 89.33618445518782 | 25.65 | 38.03 | 1243.16 | 1244.4 |
| 89.50353291186315 | 27.05 | 39.32 | 1246.15 | 1247.43 |
| 89.6708813685385 | 28.33 | 40.55 | 1249.38 | 1250.7 |
| 89.83822982521386 | 29.26 | 41.49 | 1253.55 | 1254.89 |
| 90.00557828188919 | 29.95 | 43.77 | 1258.03 | 1259.34 |
| 90.16362960208257 | 30.2 | 45.43 | 1265.83 | 1267.13 |
| 90.3309780587579 | 30.98 | 47.4 | 1277.44 | 1278.77 |
| 90.49832651543326 | 31.22 | 47.86 | 1294.15 | 1295.48 |
| 90.66567497210859 | 31.47 | 48.72 | 1310.69 | 1312.04 |
| 90.83302342878395 | 32.15 | 50.02 | 1320.13 | 1321.52 |
| 91.00037188545929 | 33.08 | 50.24 | 1327.25 | 1328.66 |
| 91.16772034213463 | 33.83 | 50.29 | 1334.44 | 1335.87 |
| 91.33506879880998 | 34.45 | 50.34 | 1341.79 | 1343.22 |
| 91.50241725548533 | 34.87 | 50.46 | 1347.21 | 1348.64 |
| 91.66976571216065 | 35.26 | 50.58 | 1351.93 | 1353.37 |
| 91.83711416883601 | 35.65 | 50.45 | 1353.82 | 1355.27 |
| 92.00446262551137 | 35.68 | 49.93 | 1355.67 | 1357.1 |
| 92.1718110821867 | 35.7 | 49.4 | 1357.49 | 1358.89 |
| 92.33915953886203 | 35.8 | 48.73 | 1357.95 | 1359.34 |
| 92.49721085905541 | 35.49 | 48.36 | 1357.04 | 1358.41 |
| 92.66455931573077 | 35.5 | 47.84 | 1354.41 | 1355.77 |
| 92.83190777240611 | 35.54 | 47.28 | 1350.66 | 1352 |
| 92.99925622908145 | 35.43 | 46.75 | 1345.75 | 1347.07 |
| 93.1666046857568 | 35.74 | 46.66 | 1338.98 | 1340.32 |
| 93.33395314243214 | 35.71 | 45.56 | 1330.86 | 1332.18 |
| 93.50130159910749 | 35.77 | 45.63 | 1318.17 | 1319.51 |
| 93.66865005578283 | 35.83 | 45.54 | 1309.43 | 1310.79 |
| 93.83599851245818 | 35.53 | 45.48 | 1304.61 | 1305.96 |
| 94.00334696913353 | 35.38 | 45.61 | 1301.16 | 1302.51 |
| 94.17069542580886 | 35.33 | 45.73 | 1297.93 | 1299.29 |
| 94.3380438824842 | 35.21 | 45.52 | 1295.23 | 1296.58 |
| 94.50539233915954 | 34.95 | 45.33 | 1295.3 | 1296.64 |
| 94.66344365935292 | 34.96 | 45.89 | 1296.94 | 1298.3 |
| 94.83079211602828 | 35.19 | 46.38 | 1296.52 | 1297.91 |
| 94.99814057270362 | 35.36 | 46.83 | 1294.66 | 1296.07 |
| 95.16548902937897 | 35.27 | 47.28 | 1292.02 | 1293.45 |
| 95.33283748605432 | 34.96 | 47.46 | 1286.99 | 1288.43 |
| 95.50018594272963 | 34.94 | 47.67 | 1280.98 | 1282.44 |
| 95.66753439940499 | 34.87 | 47.56 | 1273.91 | 1275.38 |
| 95.83488285608034 | 34.41 | 46.85 | 1264.46 | 1265.91 |
| 96.00223131275567 | 33.65 | 45.93 | 1261 | 1262.4 |
| 96.16957976943102 | 33.46 | 46.18 | 1256.08 | 1257.49 |
| 96.33692822610638 | 34.33 | 46.41 | 1244.42 | 1245.89 |
| 96.50427668278171 | 34.16 | 45.46 | 1228.35 | 1229.79 |
| 96.67162513945706 | 34.24 | 44.76 | 1216.14 | 1217.57 |
| 96.8389735961324 | 34.11 | 43.84 | 1207.83 | 1209.23 |
| 96.99702491632577 | 33.84 | 43.38 | 1203.1 | 1204.47 |
| 97.16437337300111 | 33.67 | 43.4 | 1199.46 | 1200.82 |
| 97.33172182967647 | 33.41 | 42.44 | 1196.91 | 1198.24 |
| 97.49907028635181 | 33.02 | 41.09 | 1195.89 | 1197.16 |
| 97.66641874302715 | 32.84 | 40.27 | 1197.18 | 1198.42 |
| 97.8337671997025 | 33.06 | 40.11 | 1197.99 | 1199.23 |
| 98.00111565637785 | 32.89 | 39.53 | 1196.54 | 1197.76 |
| 98.16846411305319 | 32.03 | 38.62 | 1200.52 | 1201.69 |
| 98.33581256972855 | 30.6 | 37.33 | 1204.32 | 1205.4 |
| 98.50316102640389 | 29.03 | 36.11 | 1205.69 | 1206.7 |
| 98.67050948307921 | 27.8 | 35.15 | 1205.27 | 1206.23 |
| 98.83785793975456 | 26.47 | 34.16 | 1203.99 | 1204.9 |
| 99.0052063964299 | 25.6 | 33.26 | 1201.37 | 1202.24 |
| 99.17255485310525 | 25.18 | 32.92 | 1197.14 | 1198 |
| 99.33060617329863 | 25.43 | 33.49 | 1190.47 | 1191.35 |
| 99.49795462997399 | 26.07 | 33.89 | 1185.71 | 1186.6 |
| 99.66530308664933 | 26.57 | 34.14 | 1182.59 | 1183.5 |
| 99.83265154332467 | 26.16 | 34.17 | 1181.89 | 1182.78 |
| 100.0 | 27.08 | 34.53 | 1178.87 | 1179.8 |